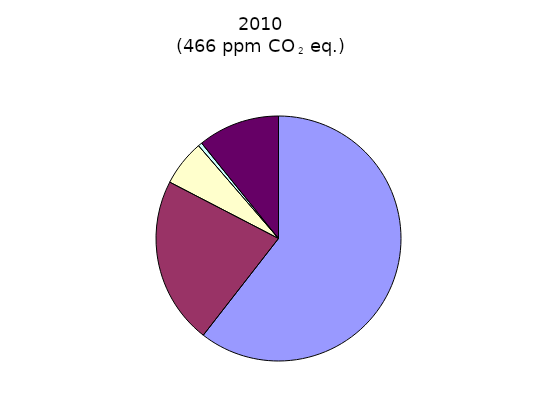
| Category | 1990 | 2010 |
|---|---|---|
| CO2 | 1.289 | 1.793 |
| CH4 | 0.47 | 0.508 |
| N2O | 0.129 | 0.174 |
| PFC,HFC,SF6 | 0.011 | 0.028 |
| Montreal gasses | 0.23 | 0.26 |